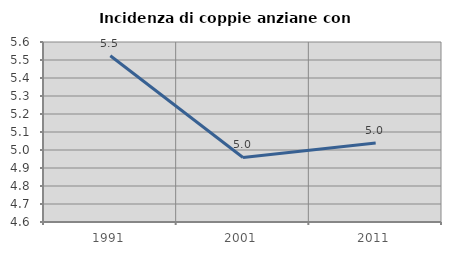
| Category | Incidenza di coppie anziane con figli |
|---|---|
| 1991.0 | 5.524 |
| 2001.0 | 4.959 |
| 2011.0 | 5.039 |